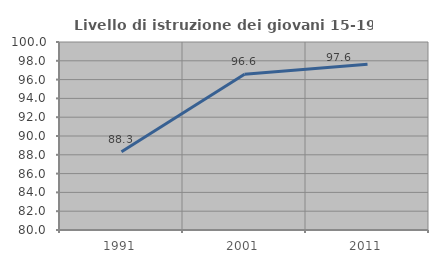
| Category | Livello di istruzione dei giovani 15-19 anni |
|---|---|
| 1991.0 | 88.331 |
| 2001.0 | 96.562 |
| 2011.0 | 97.637 |